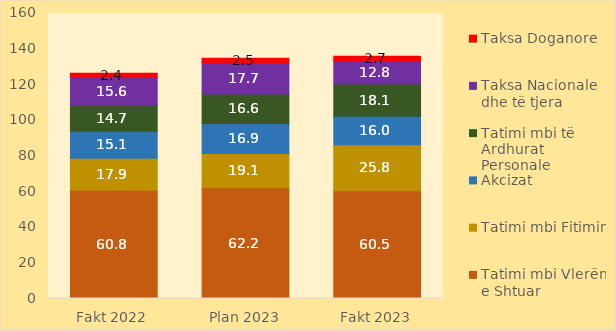
| Category | Tatimi mbi Vlerën e Shtuar | Tatimi mbi Fitimin | Akcizat | Tatimi mbi të Ardhurat Personale | Taksa Nacionale dhe të tjera | Taksa Doganore |
|---|---|---|---|---|---|---|
| Fakt 2022 | 60.821 | 17.949 | 15.087 | 14.666 | 15.61 | 2.372 |
| Plan 2023 | 62.218 | 19.122 | 16.851 | 16.587 | 17.715 | 2.454 |
| Fakt 2023 | 60.497 | 25.831 | 16.043 | 18.112 | 12.824 | 2.66 |